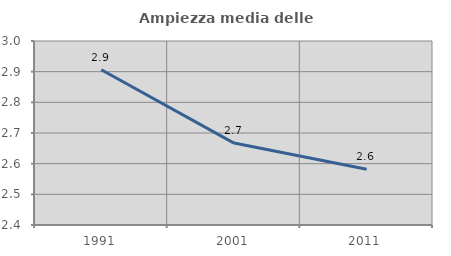
| Category | Ampiezza media delle famiglie |
|---|---|
| 1991.0 | 2.906 |
| 2001.0 | 2.667 |
| 2011.0 | 2.582 |